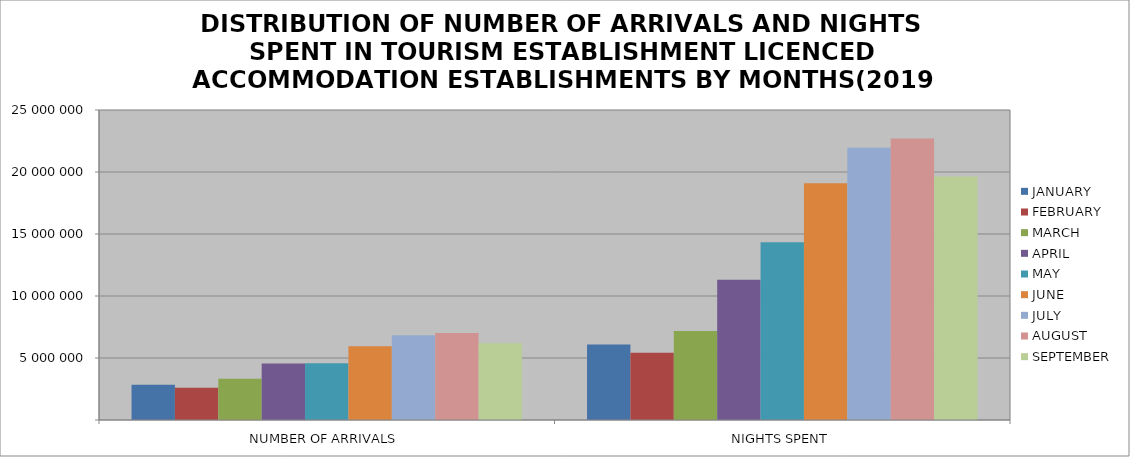
| Category | JANUARY | FEBRUARY | MARCH | APRIL | MAY | JUNE | JULY | AUGUST | SEPTEMBER |
|---|---|---|---|---|---|---|---|---|---|
| NUMBER OF ARRIVALS | 2833509 | 2607189 | 3326719 | 4561709 | 4585981 | 5949977 | 6830740 | 7020795 | 6189605 |
| NIGHTS SPENT | 6098050 | 5425989 | 7182593 | 11302946 | 14338328 | 19092571 | 21955256 | 22706728 | 19635859 |